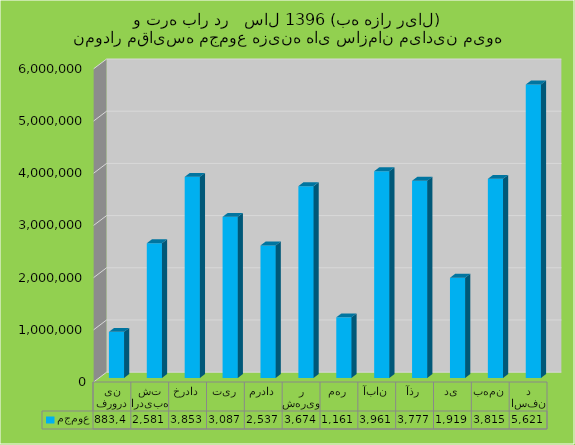
| Category | مجموع |
|---|---|
| فروردین | 883456 |
| اردیبهشت | 2581639 |
| خرداد | 3853169 |
| تیر | 3087149 |
| مرداد | 2537824 |
| شهریور | 3674936 |
| مهر | 1161844 |
| آبان | 3961326 |
| آذر | 3777634 |
| دی | 1919633 |
| بهمن | 3815121 |
| اسفند | 5621878 |